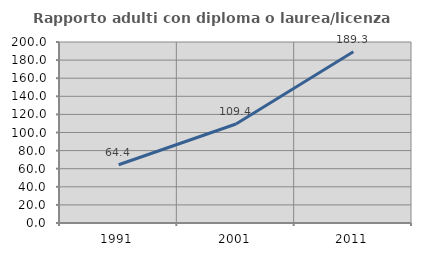
| Category | Rapporto adulti con diploma o laurea/licenza media  |
|---|---|
| 1991.0 | 64.359 |
| 2001.0 | 109.438 |
| 2011.0 | 189.286 |